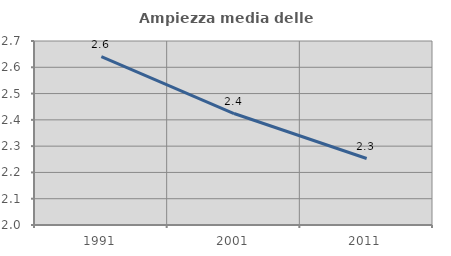
| Category | Ampiezza media delle famiglie |
|---|---|
| 1991.0 | 2.64 |
| 2001.0 | 2.424 |
| 2011.0 | 2.253 |